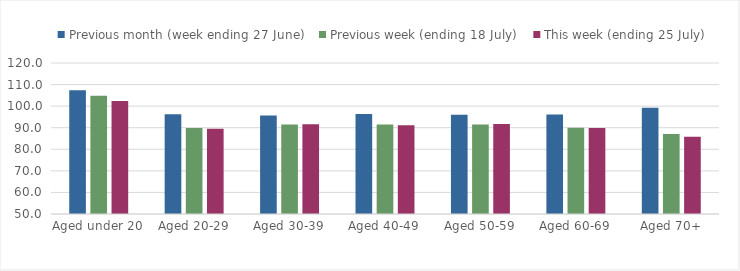
| Category | Previous month (week ending 27 June) | Previous week (ending 18 July) | This week (ending 25 July) |
|---|---|---|---|
| Aged under 20 | 107.422 | 104.789 | 102.343 |
| Aged 20-29 | 96.2 | 89.923 | 89.538 |
| Aged 30-39 | 95.716 | 91.443 | 91.648 |
| Aged 40-49 | 96.308 | 91.487 | 91.196 |
| Aged 50-59 | 96.048 | 91.532 | 91.685 |
| Aged 60-69 | 96.091 | 89.945 | 89.918 |
| Aged 70+ | 99.225 | 87.072 | 85.86 |